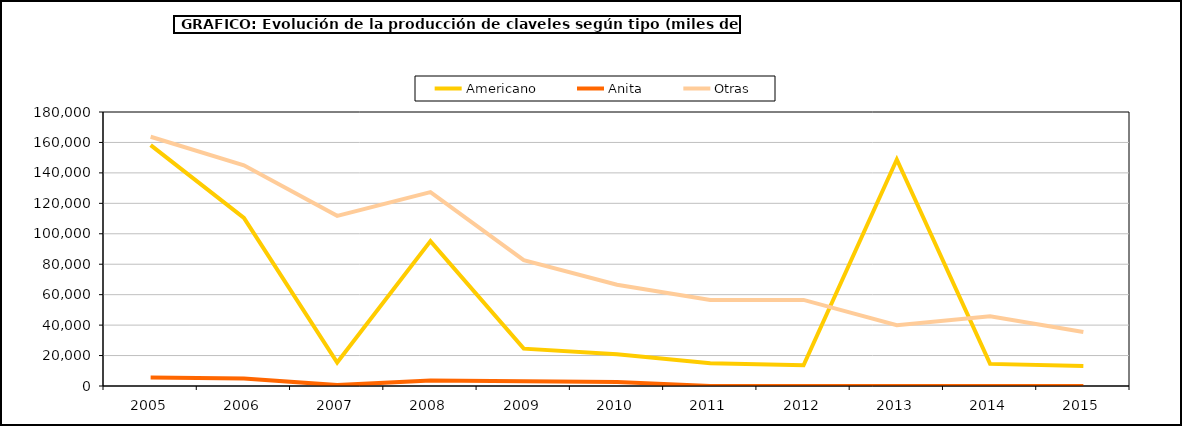
| Category | Americano | Anita | Otras |
|---|---|---|---|
| 2005.0 | 158280 | 5545 | 163741 |
| 2006.0 | 110407 | 4860 | 144998 |
| 2007.0 | 15463 | 580 | 111759 |
| 2008.0 | 95155 | 3544 | 127363 |
| 2009.0 | 24555 | 3160 | 82622 |
| 2010.0 | 20931 | 2642 | 66553 |
| 2011.0 | 15002 | 54 | 56550 |
| 2012.0 | 13658 | 0 | 56550 |
| 2013.0 | 148800 | 0 | 39920 |
| 2014.0 | 14528 | 0 | 45749 |
| 2015.0 | 13065 | 0 | 35460 |